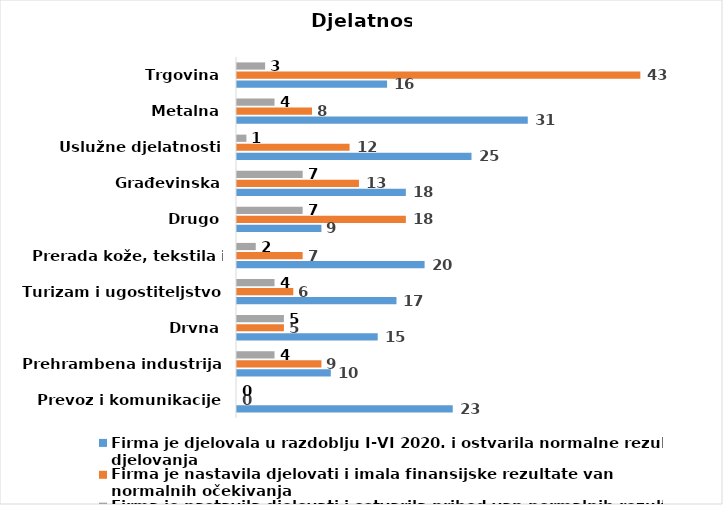
| Category | Firma je djelovala u razdoblju I-VI 2020. i ostvarila normalne rezultate djelovanja | Firma je nastavila djelovati i imala finansijske rezultate van normalnih očekivanja | Firma je nastavila djelovati i ostvarila prihod van normalnih rezultata |
|---|---|---|---|
| Prevoz i komunikacije | 23 | 0 | 0 |
| Prehrambena industrija | 10 | 9 | 4 |
| Drvna | 15 | 5 | 5 |
| Turizam i ugostiteljstvo | 17 | 6 | 4 |
| Prerada kože, tekstila i obuće | 20 | 7 | 2 |
| Drugo | 9 | 18 | 7 |
| Građevinska | 18 | 13 | 7 |
| Uslužne djelatnosti | 25 | 12 | 1 |
| Metalna | 31 | 8 | 4 |
| Trgovina | 16 | 43 | 3 |